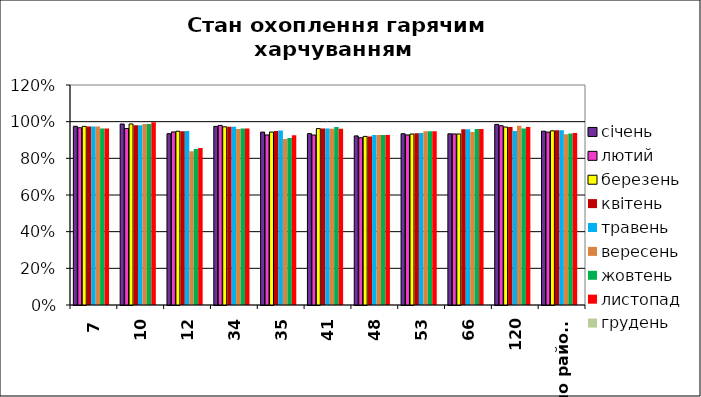
| Category | січень | лютий | березень | квітень | травень | вересень | жовтень | листопад | грудень |
|---|---|---|---|---|---|---|---|---|---|
| 7 | 0.975 | 0.967 | 0.974 | 0.974 | 0.974 | 0.973 | 0.963 | 0.963 | 0 |
| 10 | 0.987 | 0.963 | 0.987 | 0.981 | 0.981 | 0.987 | 0.987 | 0.997 | 0 |
| 12 | 0.934 | 0.944 | 0.948 | 0.948 | 0.95 | 0.839 | 0.85 | 0.857 | 0 |
| 34 | 0.974 | 0.98 | 0.972 | 0.972 | 0.972 | 0.961 | 0.963 | 0.963 | 0 |
| 35 | 0.943 | 0.928 | 0.944 | 0.949 | 0.952 | 0.905 | 0.911 | 0.926 | 0 |
| 41 | 0.935 | 0.927 | 0.962 | 0.963 | 0.963 | 0.961 | 0.971 | 0.962 | 0 |
| 48 | 0.922 | 0.912 | 0.92 | 0.92 | 0.927 | 0.927 | 0.927 | 0.927 | 0 |
| 53 | 0.934 | 0.928 | 0.933 | 0.937 | 0.938 | 0.948 | 0.948 | 0.948 | 0 |
| 66 | 0.934 | 0.933 | 0.933 | 0.958 | 0.958 | 0.944 | 0.96 | 0.96 | 0 |
| 120 | 0.985 | 0.978 | 0.971 | 0.971 | 0.949 | 0.978 | 0.963 | 0.97 | 0 |
| по району | 0.948 | 0.943 | 0.95 | 0.953 | 0.953 | 0.932 | 0.935 | 0.939 | 0 |